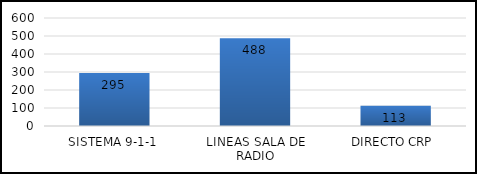
| Category | TOTAL |
|---|---|
| SISTEMA 9-1-1 | 295 |
| LINEAS SALA DE RADIO | 488 |
| DIRECTO CRP  | 113 |